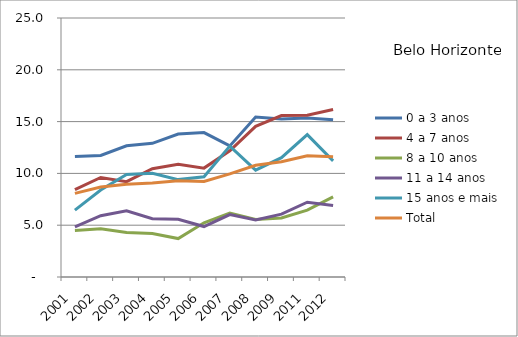
| Category | 0 a 3 anos | 4 a 7 anos | 8 a 10 anos | 11 a 14 anos | 15 anos e mais | Total |
|---|---|---|---|---|---|---|
| 2001.0 | 11.64 | 8.44 | 4.5 | 4.84 | 6.46 | 8.07 |
| 2002.0 | 11.73 | 9.61 | 4.65 | 5.92 | 8.4 | 8.68 |
| 2003.0 | 12.66 | 9.2 | 4.29 | 6.4 | 9.9 | 8.95 |
| 2004.0 | 12.9 | 10.45 | 4.19 | 5.62 | 10.01 | 9.07 |
| 2005.0 | 13.8 | 10.87 | 3.71 | 5.58 | 9.4 | 9.28 |
| 2006.0 | 13.94 | 10.51 | 5.23 | 4.87 | 9.67 | 9.22 |
| 2007.0 | 12.65 | 12.18 | 6.18 | 6.03 | 12.63 | 9.95 |
| 2008.0 | 15.45 | 14.54 | 5.56 | 5.5 | 10.32 | 10.79 |
| 2009.0 | 15.26 | 15.58 | 5.7 | 6.07 | 11.52 | 11.12 |
| 2011.0 | 15.34 | 15.61 | 6.45 | 7.22 | 13.74 | 11.71 |
| 2012.0 | 15.19 | 16.16 | 7.73 | 6.9 | 11.21 | 11.61 |